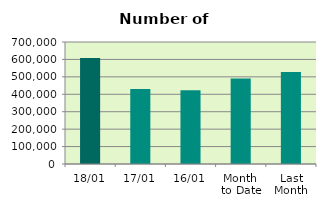
| Category | Series 0 |
|---|---|
| 18/01 | 607540 |
| 17/01 | 429724 |
| 16/01 | 423120 |
| Month 
to Date | 490215.692 |
| Last
Month | 528134.632 |